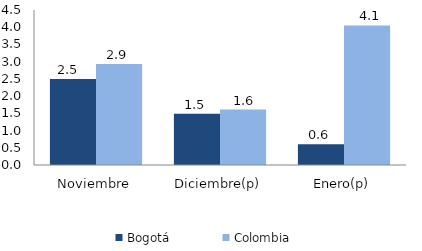
| Category | Bogotá | Colombia |
|---|---|---|
| Noviembre | 2.497 | 2.929 |
| Diciembre(p) | 1.487 | 1.609 |
| Enero(p) | 0.601 | 4.053 |